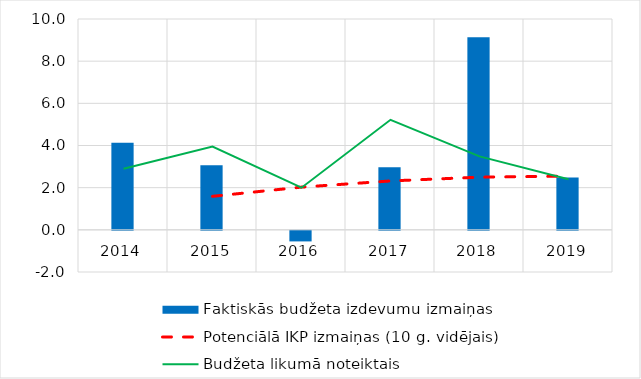
| Category | Faktiskās budžeta izdevumu izmaiņas |
|---|---|
| 2014.0 | 4.132 |
| 2015.0 | 3.065 |
| 2016.0 | -0.502 |
| 2017.0 | 2.969 |
| 2018.0 | 9.129 |
| 2019.0 | 2.477 |